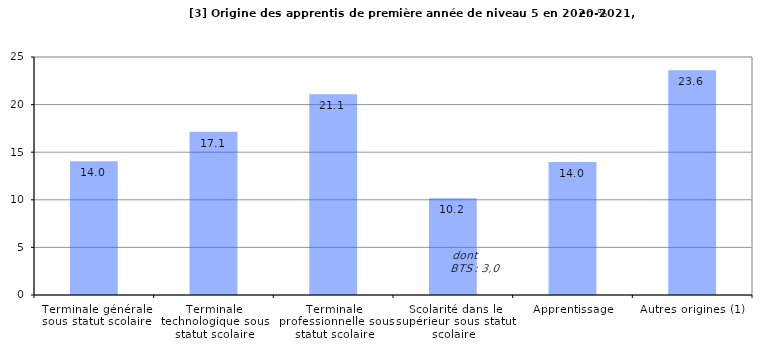
| Category | Series 0 |
|---|---|
| Terminale générale sous statut scolaire | 14.043 |
| Terminale technologique sous statut scolaire | 17.146 |
| Terminale professionnelle sous statut scolaire | 21.076 |
| Scolarité dans le supérieur sous statut scolaire | 10.151 |
| Apprentissage | 13.971 |
| Autres origines (1) | 23.613 |